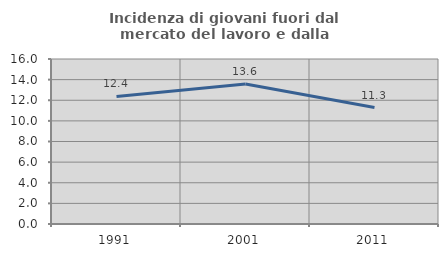
| Category | Incidenza di giovani fuori dal mercato del lavoro e dalla formazione  |
|---|---|
| 1991.0 | 12.373 |
| 2001.0 | 13.576 |
| 2011.0 | 11.288 |